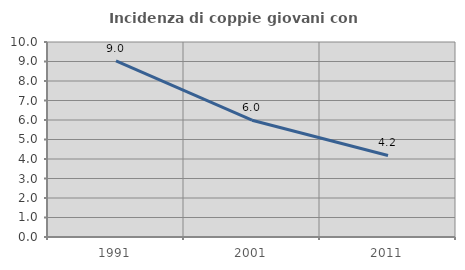
| Category | Incidenza di coppie giovani con figli |
|---|---|
| 1991.0 | 9.031 |
| 2001.0 | 5.989 |
| 2011.0 | 4.183 |